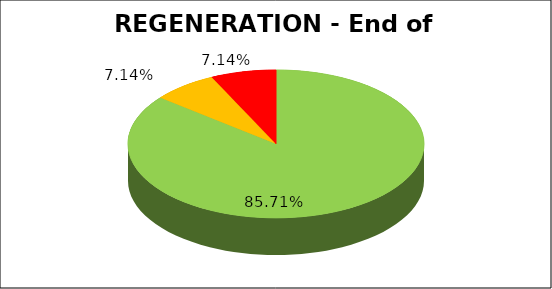
| Category | Series 0 |
|---|---|
| Green | 0.857 |
| Amber | 0.071 |
| Red | 0.071 |